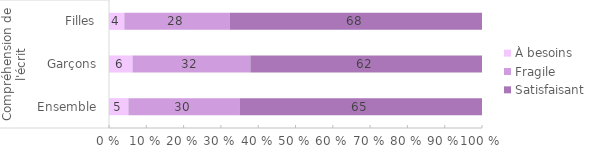
| Category | À besoins | Fragile | Satisfaisant |
|---|---|---|---|
| 0 | 5.2 | 29.8 | 65 |
| 1 | 6.3 | 31.6 | 62.1 |
| 2 | 4.1 | 28.3 | 67.5 |